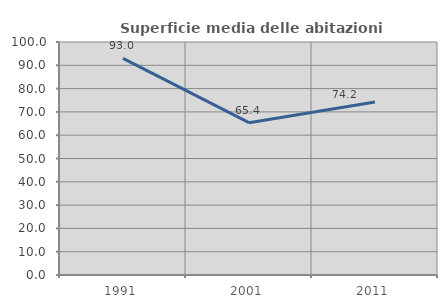
| Category | Superficie media delle abitazioni occupate |
|---|---|
| 1991.0 | 93 |
| 2001.0 | 65.375 |
| 2011.0 | 74.235 |